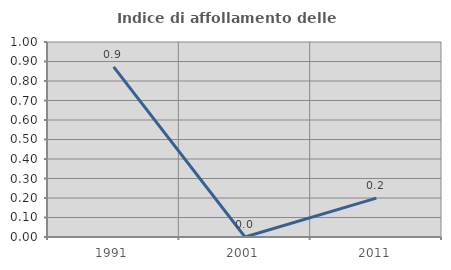
| Category | Indice di affollamento delle abitazioni  |
|---|---|
| 1991.0 | 0.873 |
| 2001.0 | 0 |
| 2011.0 | 0.2 |